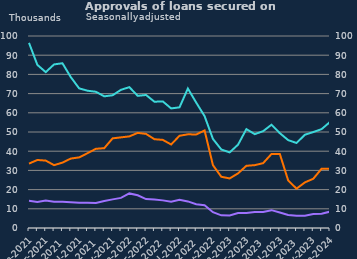
| Category | Remortgaging | Other |
|---|---|---|
| Jan-2021 | 33534 | 14146 |
| Feb-2021 | 35434 | 13572 |
| Mar-2021 | 35099 | 14318 |
| Apr-2021 | 32728 | 13735 |
| May-2021 | 34061 | 13632 |
| Jun-2021 | 36166 | 13457 |
| Jul-2021 | 36781 | 13171 |
| Aug-2021 | 38969 | 13158 |
| Sep-2021 | 41247 | 13042 |
| Oct-2021 | 41577 | 14090 |
| Nov-2021 | 46697 | 14914 |
| Dec-2021 | 47206 | 15690 |
| Jan-2022 | 47714 | 18011 |
| Feb-2022 | 49546 | 17039 |
| Mar-2022 | 49005 | 15062 |
| Apr-2022 | 46249 | 14860 |
| May-2022 | 45892 | 14389 |
| Jun-2022 | 43502 | 13674 |
| Jul-2022 | 48038 | 14697 |
| Aug-2022 | 48793 | 13844 |
| Sep-2022 | 48719 | 12347 |
| Oct-2022 | 50799 | 11844 |
| Nov-2022 | 32726 | 8243 |
| Dec-2022 | 26679 | 6582 |
| Jan-2023 | 25819 | 6531 |
| Feb-2023 | 28440 | 7790 |
| Mar-2023 | 32395 | 7853 |
| Apr-2023 | 32738 | 8382 |
| May-2023 | 33764 | 8287 |
| Jun-2023 | 38542 | 9293 |
| Jul-2023 | 38557 | 8069 |
| Aug-2023 | 24741 | 6805 |
| Sep-2023 | 20492 | 6392 |
| Oct-2023 | 23774 | 6337 |
| Nov-2023 | 25644 | 7322 |
| Dec-2023 | 30917 | 7394 |
| Jan-2024 | 30885 | 8533 |